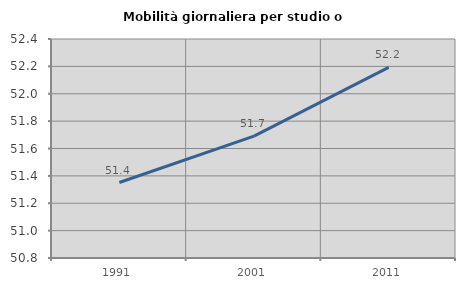
| Category | Mobilità giornaliera per studio o lavoro |
|---|---|
| 1991.0 | 51.351 |
| 2001.0 | 51.691 |
| 2011.0 | 52.193 |